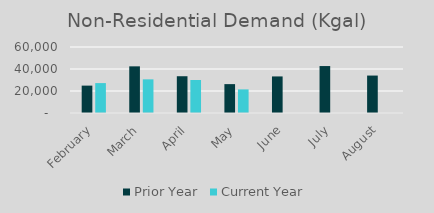
| Category | Prior Year | Current Year |
|---|---|---|
| February | 24891.705 | 27184.287 |
| March | 42416.796 | 30591.784 |
| April | 33427.881 | 30008.586 |
| May | 26254.448 | 21459.484 |
| June | 33248.873 | 0 |
| July | 42679.938 | 0 |
| August | 34036.498 | 0 |